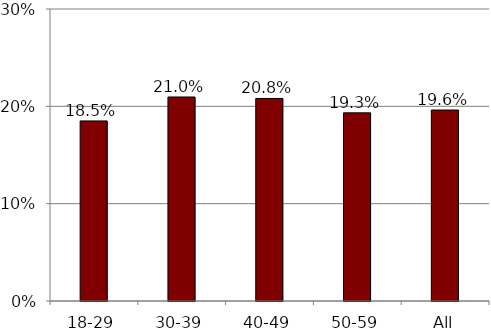
| Category | Share of withdraw |
|---|---|
| 18-29 | 0.185 |
| 30-39 | 0.21 |
| 40-49 | 0.208 |
| 50-59 | 0.193 |
| All | 0.196 |